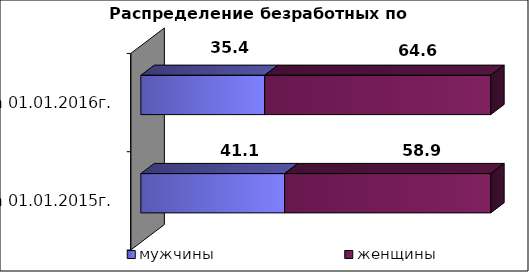
| Category | мужчины  | женщины  |
|---|---|---|
| на 01.01.2015г. | 41.1 | 58.9 |
| на 01.01.2016г. | 35.4 | 64.6 |